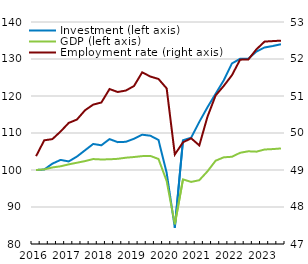
| Category | Investment (left axis) | GDP (left axis) |
|---|---|---|
| 2016.0 | 100 | 100 |
| nan | 100.133 | 100.16 |
| nan | 101.718 | 100.691 |
| nan | 102.729 | 101 |
| 2017.0 | 102.316 | 101.523 |
| nan | 103.622 | 101.96 |
| nan | 105.334 | 102.407 |
| nan | 107.037 | 102.957 |
| 2018.0 | 106.681 | 102.847 |
| nan | 108.354 | 102.893 |
| nan | 107.529 | 103.023 |
| nan | 107.618 | 103.323 |
| 2019.0 | 108.449 | 103.51 |
| nan | 109.535 | 103.748 |
| nan | 109.272 | 103.81 |
| nan | 108.119 | 102.976 |
| 2020.0 | 99.234 | 97.019 |
| nan | 84.396 | 85.339 |
| nan | 108.031 | 97.461 |
| nan | 108.708 | 96.78 |
| 2021.0 | 113.009 | 97.244 |
| nan | 116.958 | 99.636 |
| nan | 120.625 | 102.516 |
| nan | 124.257 | 103.431 |
| 2022.0 | 128.824 | 103.576 |
| nan | 130.059 | 104.652 |
| nan | 130.088 | 105.056 |
| nan | 132.025 | 104.957 |
| 2023.0 | 133.123 | 105.541 |
| nan | 133.523 | 105.653 |
| nan | 133.99 | 105.825 |